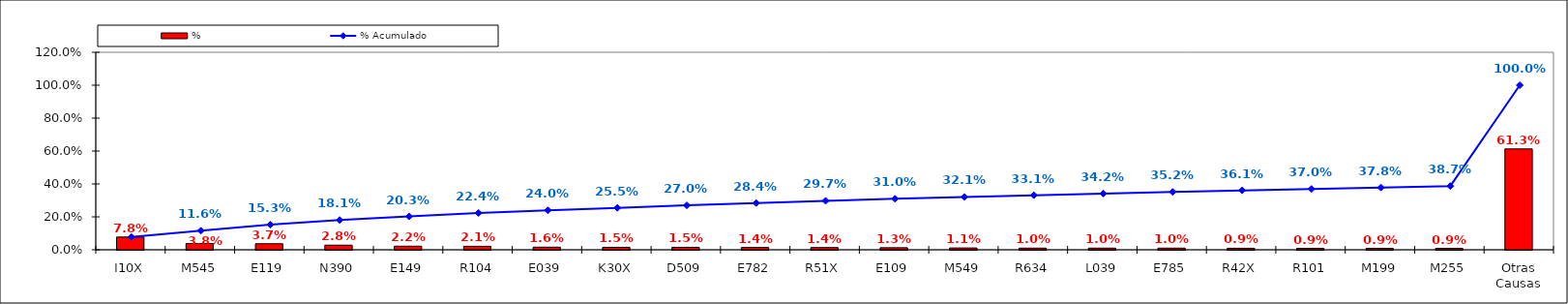
| Category | % |
|---|---|
| I10X | 0.078 |
| M545 | 0.038 |
| E119 | 0.037 |
| N390 | 0.028 |
| E149 | 0.022 |
| R104 | 0.021 |
| E039 | 0.016 |
| K30X | 0.015 |
| D509 | 0.015 |
| E782 | 0.014 |
| R51X | 0.014 |
| E109 | 0.013 |
| M549 | 0.011 |
| R634 | 0.01 |
| L039 | 0.01 |
| E785 | 0.01 |
| R42X | 0.009 |
| R101 | 0.009 |
| M199 | 0.009 |
| M255 | 0.009 |
| Otras Causas | 0.613 |